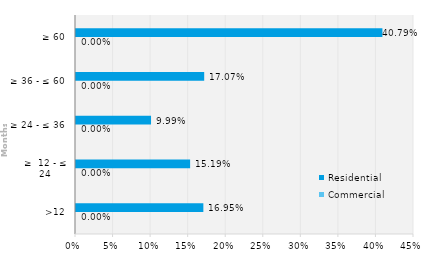
| Category | Commercial | Residential |
|---|---|---|
| >12 | 0 | 0.17 |
| ≥  12 - ≤ 24 | 0 | 0.152 |
| ≥ 24 - ≤ 36 | 0 | 0.1 |
| ≥ 36 - ≤ 60 | 0 | 0.171 |
| ≥ 60 | 0 | 0.408 |